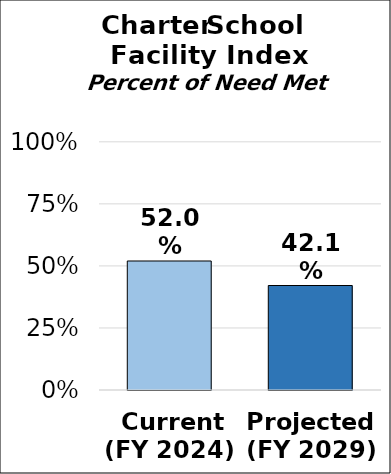
| Category | Charter School Facility Index |
|---|---|
|  Current
(FY 2024) | 0.52 |
| Projected
(FY 2029) | 0.421 |